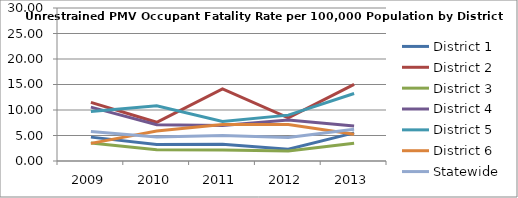
| Category | District 1 | District 2 | District 3 | District 4 | District 5 | District 6 | Statewide |
|---|---|---|---|---|---|---|---|
| 2009.0 | 4.68 | 11.484 | 3.526 | 10.556 | 9.725 | 3.457 | 5.775 |
| 2010.0 | 3.253 | 7.589 | 2.187 | 7.129 | 10.808 | 5.868 | 4.722 |
| 2011.0 | 3.262 | 14.122 | 2.141 | 6.951 | 7.769 | 7.167 | 5.001 |
| 2012.0 | 2.321 | 8.451 | 1.971 | 8.014 | 8.996 | 7.159 | 4.606 |
| 2013.0 | 5.516 | 15.011 | 3.46 | 6.883 | 13.242 | 5.224 | 6.204 |